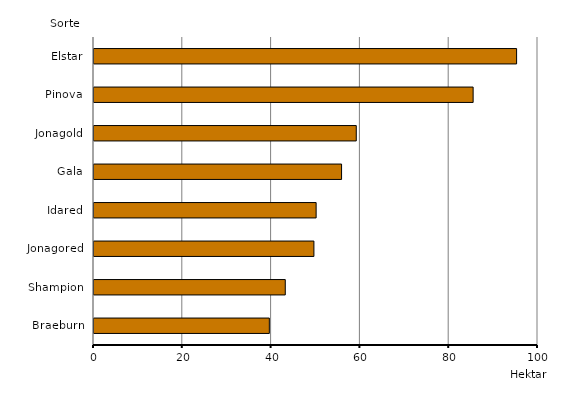
| Category | Series 0 |
|---|---|
| Elstar | 95.18 |
| Pinova | 85.39 |
| Jonagold | 59.07 |
| Gala | 55.76 |
| Idared | 50.03 |
| Jonagored | 49.53 |
| Shampion | 43.08 |
| Braeburn | 39.49 |